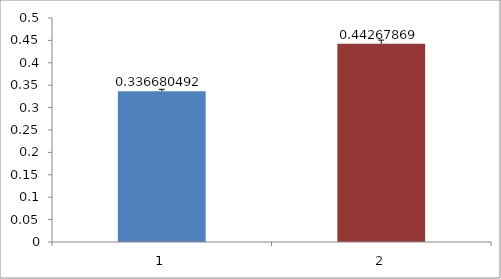
| Category | Series 0 |
|---|---|
| 0 | 0.337 |
| 1 | 0.443 |